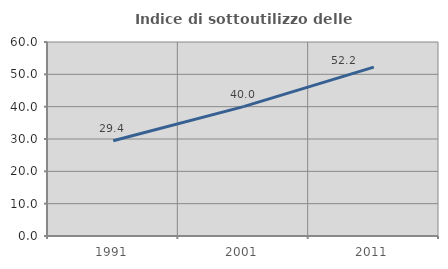
| Category | Indice di sottoutilizzo delle abitazioni  |
|---|---|
| 1991.0 | 29.439 |
| 2001.0 | 40 |
| 2011.0 | 52.212 |